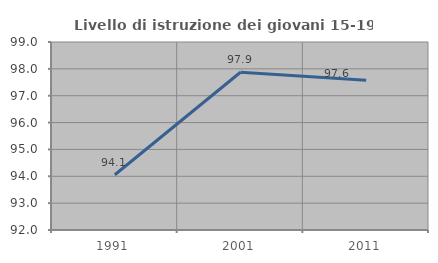
| Category | Livello di istruzione dei giovani 15-19 anni |
|---|---|
| 1991.0 | 94.057 |
| 2001.0 | 97.872 |
| 2011.0 | 97.573 |